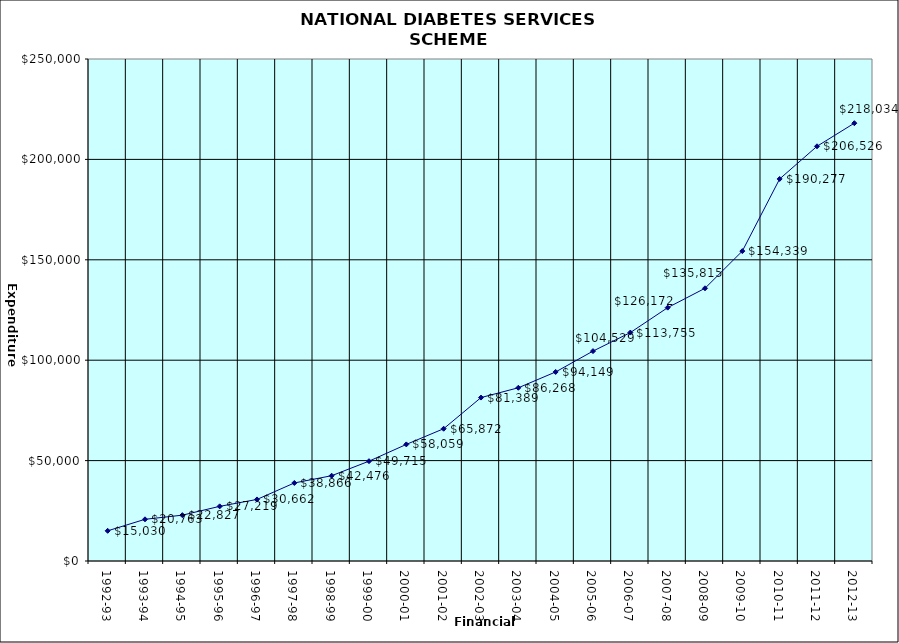
| Category | Series 0 |
|---|---|
| 1992-93 | 15030 |
| 1993-94 | 20763 |
| 1994-95 | 22827 |
| 1995-96 | 27219 |
| 1996-97 | 30662 |
| 1997-98 | 38866 |
| 1998-99 | 42476 |
| 1999-00 | 49715 |
| 2000-01 | 58059 |
| 2001-02 | 65872 |
| 2002-03 | 81389 |
| 2003-04 | 86268 |
| 2004-05 | 94149 |
| 2005-06 | 104529 |
| 2006-07 | 113755 |
| 2007-08 | 126172 |
| 2008-09 | 135815 |
| 2009-10 | 154339 |
| 2010-11 | 190277 |
| 2011-12 | 206526 |
| 2012-13 | 218034 |